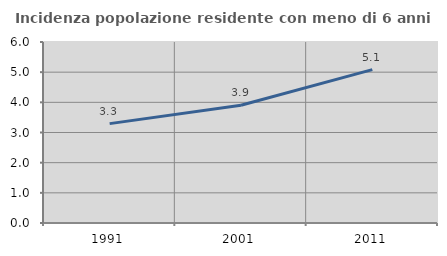
| Category | Incidenza popolazione residente con meno di 6 anni |
|---|---|
| 1991.0 | 3.294 |
| 2001.0 | 3.901 |
| 2011.0 | 5.084 |